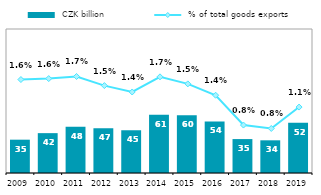
| Category |  CZK billion |
|---|---|
| 2009.0 | 34.704 |
| 2010.0 | 41.516 |
| 2011.0 | 48.242 |
| 2012.0 | 46.622 |
| 2013.0 | 44.651 |
| 2014.0 | 60.574 |
| 2015.0 | 60.08 |
| 2016.0 | 53.661 |
| 2017.0 | 35.335 |
| 2018.0 | 34.049 |
| 2019.0 | 52.438 |